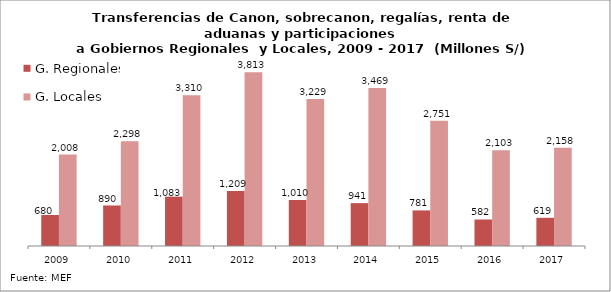
| Category | G. Regionales | G. Locales |
|---|---|---|
| 2009.0 | 680.41 | 2008.165 |
| 2010.0 | 889.69 | 2298.376 |
| 2011.0 | 1083.102 | 3309.895 |
| 2012.0 | 1208.793 | 3813.214 |
| 2013.0 | 1010.35 | 3228.93 |
| 2014.0 | 940.781 | 3469.364 |
| 2015.0 | 781.333 | 2750.781 |
| 2016.0 | 581.812 | 2103.487 |
| 2017.0 | 618.959 | 2158.389 |